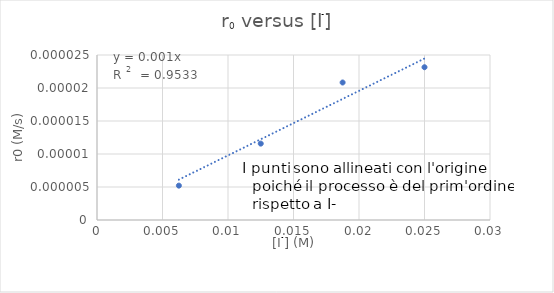
| Category | Series 4 |
|---|---|
| 0.00625 | 0 |
| 0.0125 | 0 |
| 0.01875 | 0 |
| 0.025 | 0 |